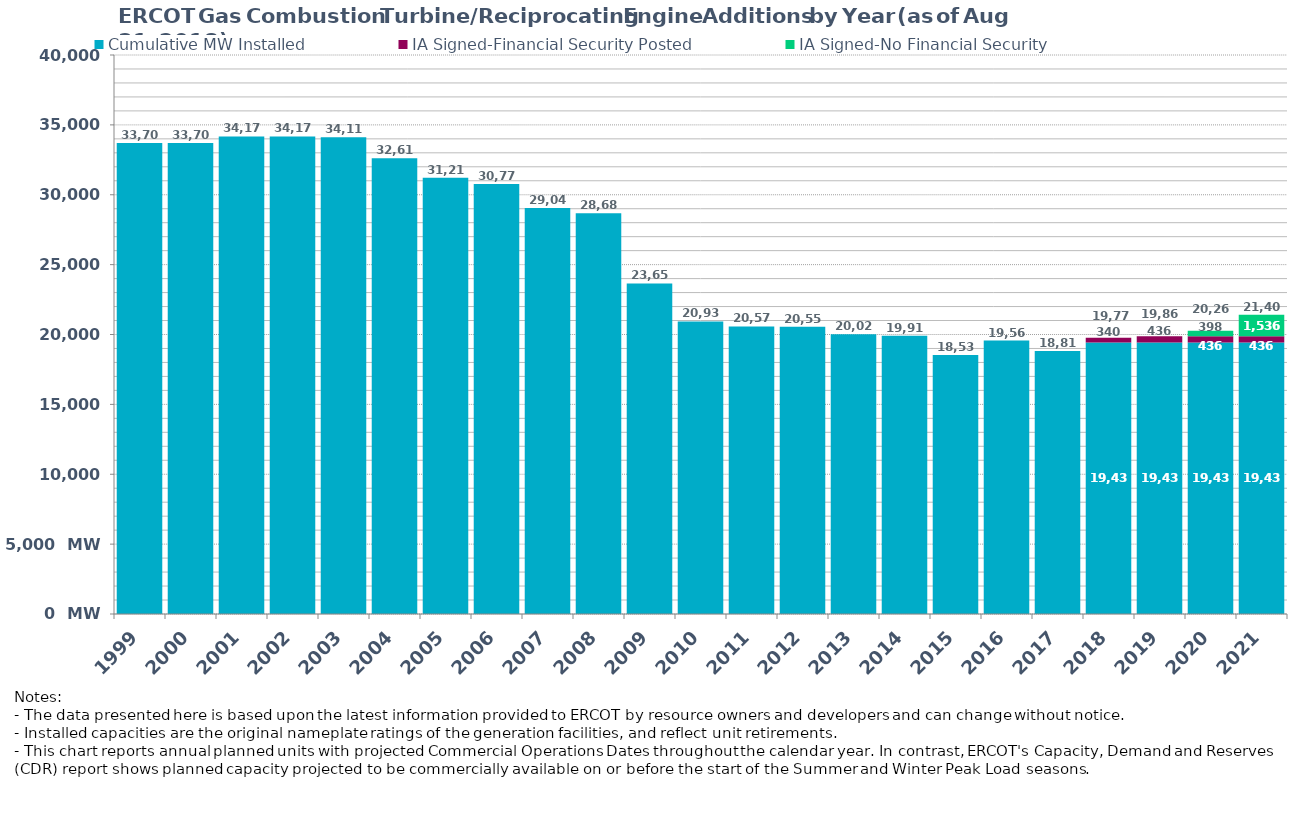
| Category | Cumulative MW Installed | IA Signed-Financial Security Posted  | IA Signed-No Financial Security  | Cumulative Installed and Planned |
|---|---|---|---|---|
| 1999.0 | 33703 | 0 | 0 | 33703 |
| 2000.0 | 33703 | 0 | 0 | 33703 |
| 2001.0 | 34170 | 0 | 0 | 34170 |
| 2002.0 | 34170 | 0 | 0 | 34170 |
| 2003.0 | 34118 | 0 | 0 | 34118 |
| 2004.0 | 32616 | 0 | 0 | 32616 |
| 2005.0 | 31217 | 0 | 0 | 31217 |
| 2006.0 | 30774 | 0 | 0 | 30774 |
| 2007.0 | 29048 | 0 | 0 | 29048 |
| 2008.0 | 28681 | 0 | 0 | 28681 |
| 2009.0 | 23651 | 0 | 0 | 23651 |
| 2010.0 | 20937 | 0 | 0 | 20937 |
| 2011.0 | 20575 | 0 | 0 | 20575 |
| 2012.0 | 20551 | 0 | 0 | 20551 |
| 2013.0 | 20026 | 0 | 0 | 20026 |
| 2014.0 | 19917 | 0 | 0 | 19917 |
| 2015.0 | 18538 | 0 | 0 | 18538 |
| 2016.0 | 19564 | 0 | 0 | 19564 |
| 2017.0 | 18818 | 0 | 0 | 18818 |
| 2018.0 | 19433 | 340 | 0 | 19773 |
| 2019.0 | 19433 | 436 | 0 | 19869 |
| 2020.0 | 19433 | 436 | 397.8 | 20266.8 |
| 2021.0 | 19433 | 436 | 1535.8 | 21404.8 |